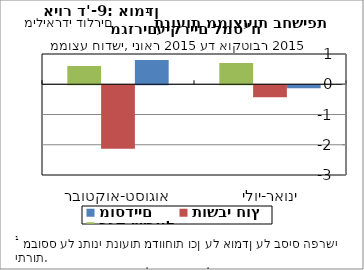
| Category | מוסדיים  | תושבי חוץ | בנק ישראל |
|---|---|---|---|
|  ינואר-יולי | -100 | -400 | 700 |
| אוגוסט-אוקטובר | 800 | -2100 | 600 |